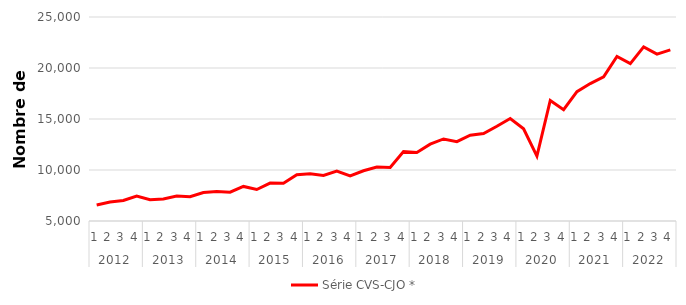
| Category | Série CVS-CJO * |
|---|---|
| 0 | 6561.931 |
| 1 | 6853.525 |
| 2 | 7007.314 |
| 3 | 7450.758 |
| 4 | 7080.938 |
| 5 | 7167.459 |
| 6 | 7439.683 |
| 7 | 7382.892 |
| 8 | 7798.499 |
| 9 | 7901.413 |
| 10 | 7830.004 |
| 11 | 8390.594 |
| 12 | 8086.386 |
| 13 | 8715.716 |
| 14 | 8694.348 |
| 15 | 9529.395 |
| 16 | 9634.383 |
| 17 | 9458.935 |
| 18 | 9884.267 |
| 19 | 9425.035 |
| 20 | 9926.247 |
| 21 | 10285.333 |
| 22 | 10250.053 |
| 23 | 11820.237 |
| 24 | 11724.287 |
| 25 | 12535.005 |
| 26 | 13044.445 |
| 27 | 12778.832 |
| 28 | 13409.373 |
| 29 | 13575.408 |
| 30 | 14284.088 |
| 31 | 15054.248 |
| 32 | 14035.731 |
| 33 | 11353.639 |
| 34 | 16814.046 |
| 35 | 15912.845 |
| 36 | 17682.937 |
| 37 | 18476.2 |
| 38 | 19140.899 |
| 39 | 21132.447 |
| 40 | 20426.497 |
| 41 | 22077.458 |
| 42 | 21367.064 |
| 43 | 21779.317 |